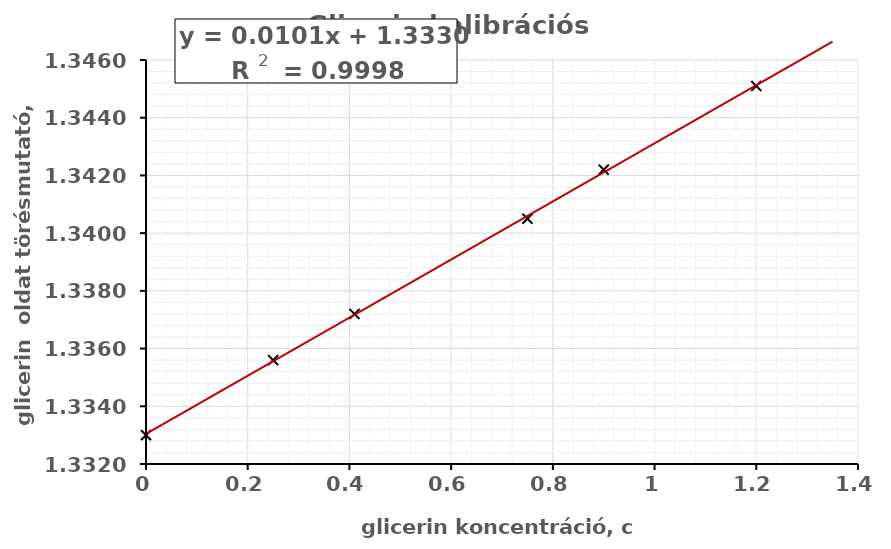
| Category | Series 0 |
|---|---|
| 0.0 | 1.333 |
| 0.25 | 1.336 |
| 0.41 | 1.337 |
| 0.75 | 1.34 |
| 0.9 | 1.342 |
| 1.2 | 1.345 |